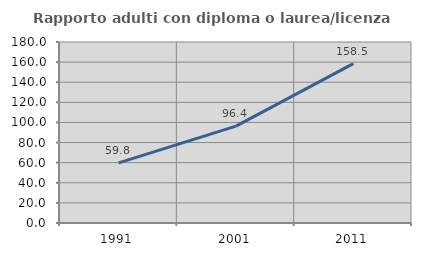
| Category | Rapporto adulti con diploma o laurea/licenza media  |
|---|---|
| 1991.0 | 59.752 |
| 2001.0 | 96.403 |
| 2011.0 | 158.463 |